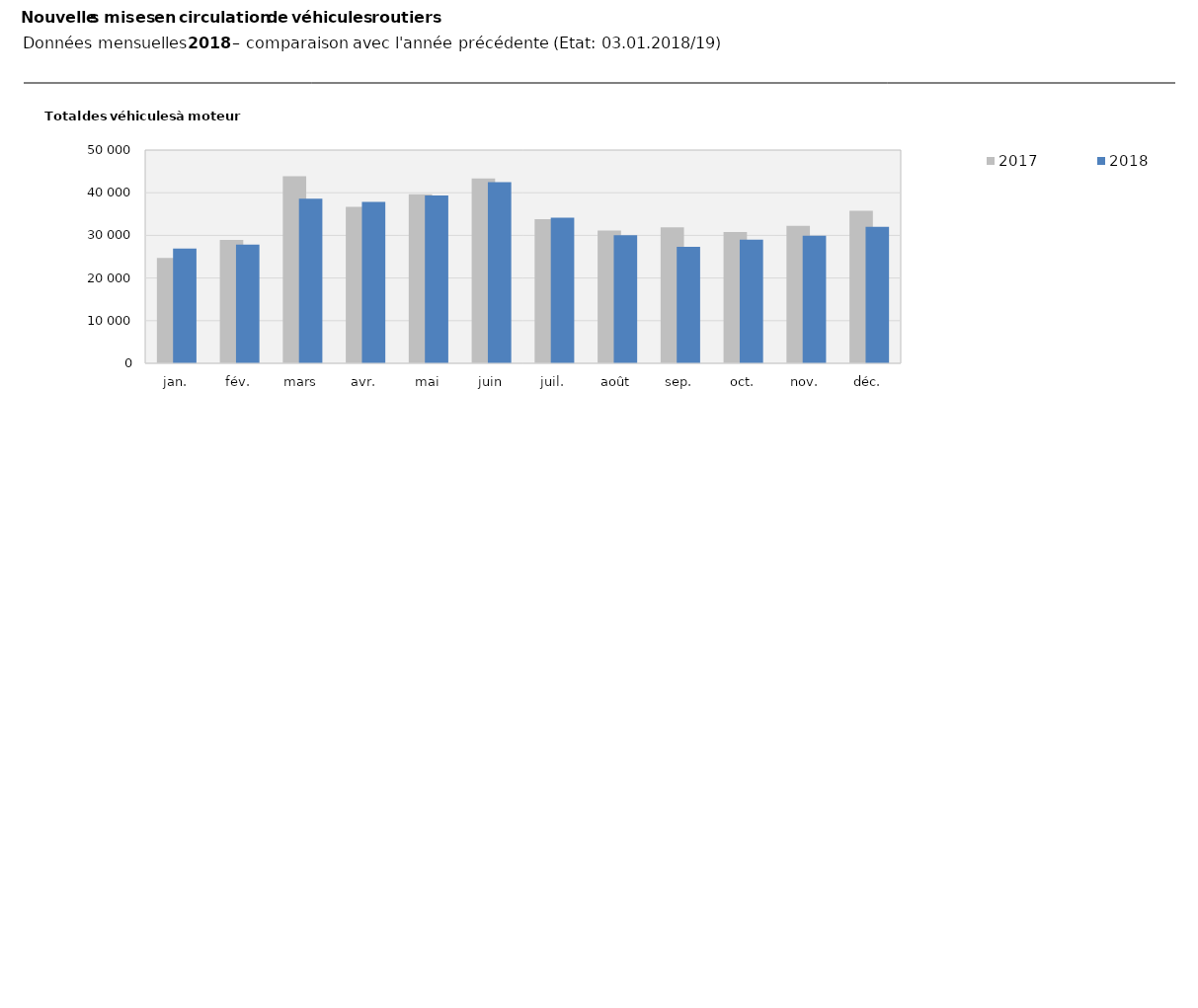
| Category | 2017 | 2018 |
|---|---|---|
| jan. | 24684 | 26923 |
| fév. | 28910 | 27829 |
| mars | 43850 | 38587 |
| avr. | 36715 | 37846 |
| mai | 39663 | 39349 |
| juin | 43373 | 42480 |
| juil. | 33772 | 34171 |
| août | 31139 | 30026 |
| sep. | 31894 | 27310 |
| oct. | 30790 | 28966 |
| nov. | 32246 | 29910 |
| déc. | 35791 | 32016 |